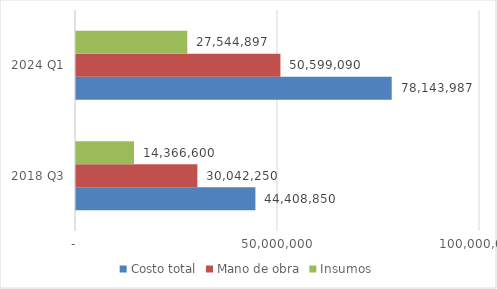
| Category | Costo total | Mano de obra | Insumos |
|---|---|---|---|
| 2018 Q3 | 44408850 | 30042250 | 14366600 |
| 2024 Q1 | 78143986.541 | 50599090 | 27544896.541 |